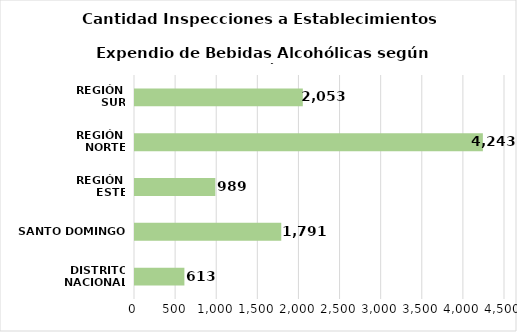
| Category | Series 0 |
|---|---|
| DISTRITO NACIONAL | 613 |
| SANTO DOMINGO | 1791 |
| REGIÓN 
ESTE | 989 |
| REGIÓN 
NORTE | 4243 |
| REGIÓN 
SUR | 2053 |